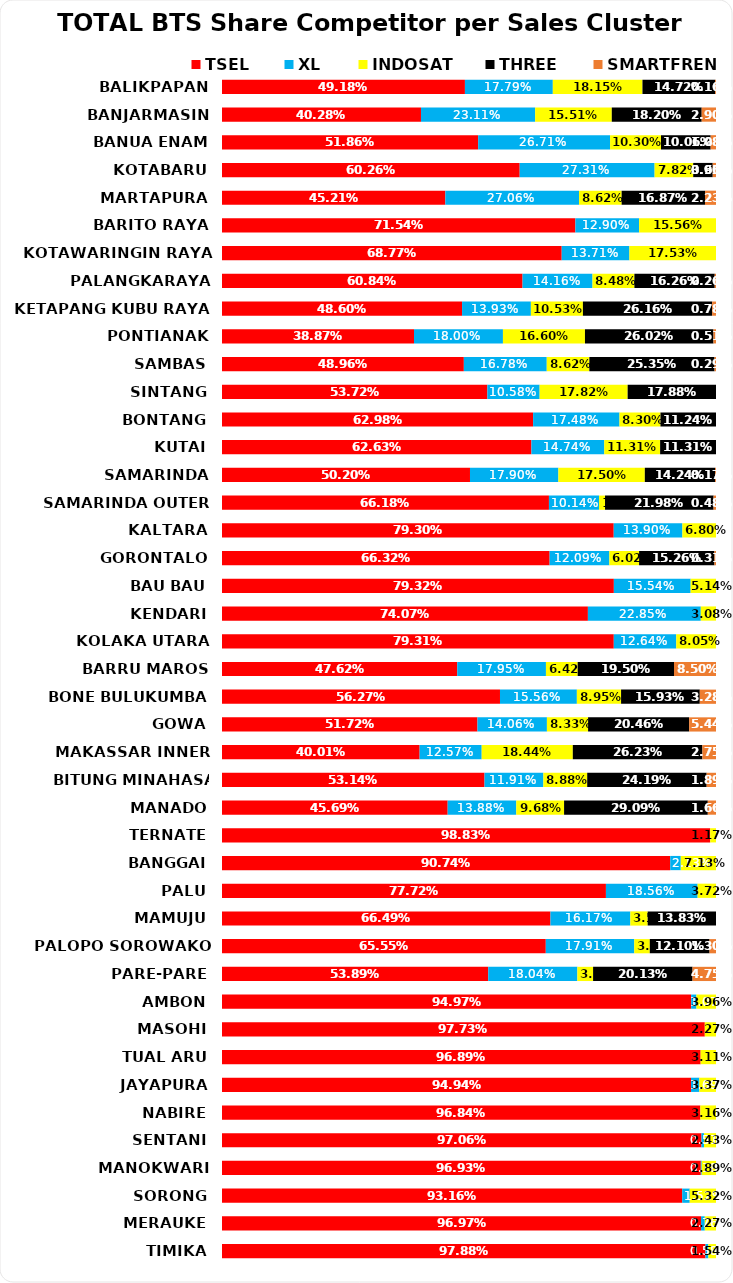
| Category | TSEL | XL | INDOSAT | THREE | SMARTFREN |
|---|---|---|---|---|---|
| BALIKPAPAN | 0.492 | 0.178 | 0.181 | 0.147 | 0.002 |
| BANJARMASIN | 0.403 | 0.231 | 0.155 | 0.182 | 0.029 |
| BANUA ENAM | 0.519 | 0.267 | 0.103 | 0.101 | 0.011 |
| KOTABARU | 0.603 | 0.273 | 0.078 | 0.04 | 0.007 |
| MARTAPURA | 0.452 | 0.271 | 0.086 | 0.169 | 0.022 |
| BARITO RAYA | 0.715 | 0.129 | 0.156 | 0 | 0 |
| KOTAWARINGIN RAYA | 0.688 | 0.137 | 0.175 | 0 | 0 |
| PALANGKARAYA | 0.608 | 0.142 | 0.085 | 0.163 | 0.003 |
| KETAPANG KUBU RAYA | 0.486 | 0.139 | 0.105 | 0.262 | 0.008 |
| PONTIANAK | 0.389 | 0.18 | 0.166 | 0.26 | 0.005 |
| SAMBAS | 0.49 | 0.168 | 0.086 | 0.253 | 0.003 |
| SINTANG | 0.537 | 0.106 | 0.178 | 0.179 | 0 |
| BONTANG | 0.63 | 0.175 | 0.083 | 0.112 | 0 |
| KUTAI | 0.626 | 0.147 | 0.113 | 0.113 | 0 |
| SAMARINDA | 0.502 | 0.179 | 0.175 | 0.142 | 0.002 |
| SAMARINDA OUTER | 0.662 | 0.101 | 0.012 | 0.22 | 0.005 |
| KALTARA | 0.793 | 0.139 | 0.068 | 0 | 0 |
| GORONTALO | 0.663 | 0.121 | 0.06 | 0.153 | 0.003 |
| BAU BAU | 0.793 | 0.155 | 0.051 | 0 | 0 |
| KENDARI | 0.741 | 0.228 | 0.031 | 0 | 0 |
| KOLAKA UTARA | 0.793 | 0.126 | 0.08 | 0 | 0 |
| BARRU MAROS | 0.476 | 0.18 | 0.064 | 0.195 | 0.085 |
| BONE BULUKUMBA | 0.563 | 0.156 | 0.089 | 0.159 | 0.033 |
| GOWA | 0.517 | 0.141 | 0.083 | 0.205 | 0.054 |
| MAKASSAR INNER | 0.4 | 0.126 | 0.184 | 0.262 | 0.028 |
| BITUNG MINAHASA TALAUD | 0.531 | 0.119 | 0.089 | 0.242 | 0.019 |
| MANADO | 0.457 | 0.139 | 0.097 | 0.291 | 0.017 |
| TERNATE | 0.988 | 0 | 0.012 | 0 | 0 |
| BANGGAI | 0.907 | 0.021 | 0.071 | 0 | 0 |
| PALU | 0.777 | 0.186 | 0.037 | 0 | 0 |
| MAMUJU | 0.665 | 0.162 | 0.035 | 0.138 | 0 |
| PALOPO SOROWAKO | 0.655 | 0.179 | 0.031 | 0.121 | 0.013 |
| PARE-PARE | 0.539 | 0.18 | 0.032 | 0.201 | 0.047 |
| AMBON | 0.95 | 0.011 | 0.04 | 0 | 0 |
| MASOHI | 0.977 | 0 | 0.023 | 0 | 0 |
| TUAL ARU | 0.969 | 0 | 0.031 | 0 | 0 |
| JAYAPURA | 0.949 | 0.017 | 0.034 | 0 | 0 |
| NABIRE | 0.968 | 0 | 0.032 | 0 | 0 |
| SENTANI | 0.971 | 0.005 | 0.024 | 0 | 0 |
| MANOKWARI | 0.969 | 0.002 | 0.029 | 0 | 0 |
| SORONG | 0.932 | 0.015 | 0.053 | 0 | 0 |
| MERAUKE | 0.97 | 0.008 | 0.023 | 0 | 0 |
| TIMIKA | 0.979 | 0.006 | 0.015 | 0 | 0 |